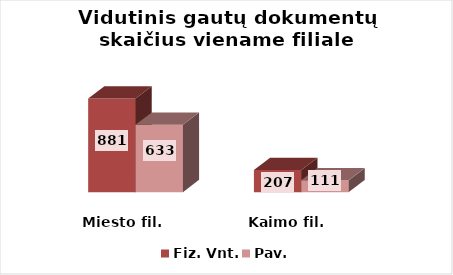
| Category | Fiz. Vnt. | Pav. |
|---|---|---|
| Miesto fil. | 881 | 633 |
| Kaimo fil. | 207 | 111 |